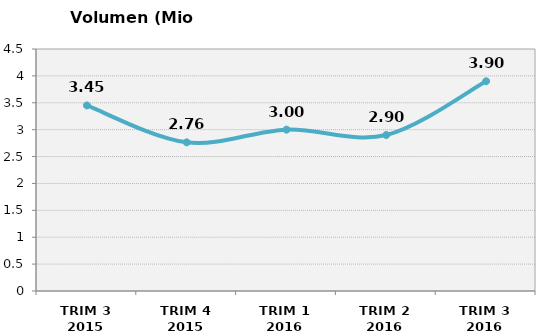
| Category | Volumen (Mio consumiciones) |
|---|---|
| TRIM 3 2015 | 3.45 |
| TRIM 4 2015 | 2.764 |
| TRIM 1 2016 | 3 |
| TRIM 2 2016 | 2.9 |
| TRIM 3 2016 | 3.9 |